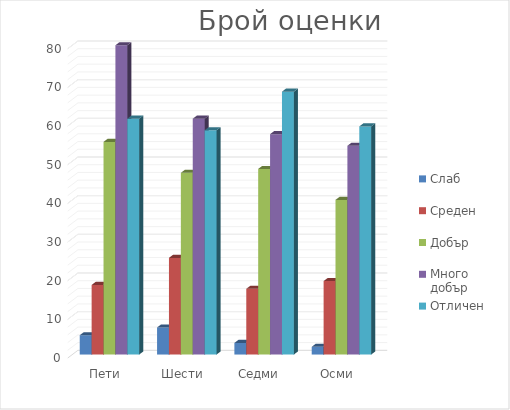
| Category | Слаб | Среден | Добър | Много добър | Отличен |
|---|---|---|---|---|---|
| Пети | 5 | 18 | 55 | 80 | 61 |
| Шести | 7 | 25 | 47 | 61 | 58 |
| Седми | 3 | 17 | 48 | 57 | 68 |
| Осми | 2 | 19 | 40 | 54 | 59 |